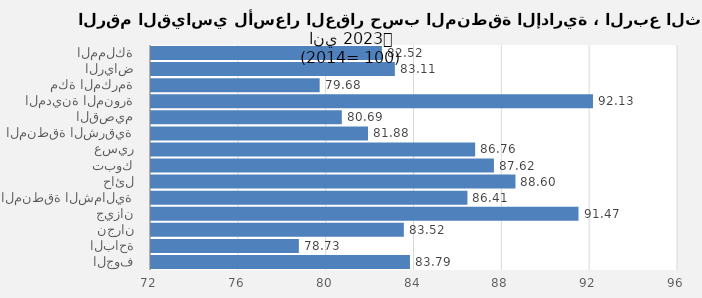
| Category | 2023 |
|---|---|
| المملكة | 82.516 |
| الرياض | 83.106 |
| مكة المكرمة | 79.682 |
| المدينة المنورة | 92.128 |
| القصيم | 80.69 |
| المنطقة الشرقية | 81.882 |
| عسير | 86.762 |
| تبوك | 87.618 |
| حائل | 88.598 |
| المنطقة الشمالية | 86.411 |
| جيزان | 91.469 |
| نجران | 83.515 |
| الباحة | 78.734 |
| الجوف | 83.793 |